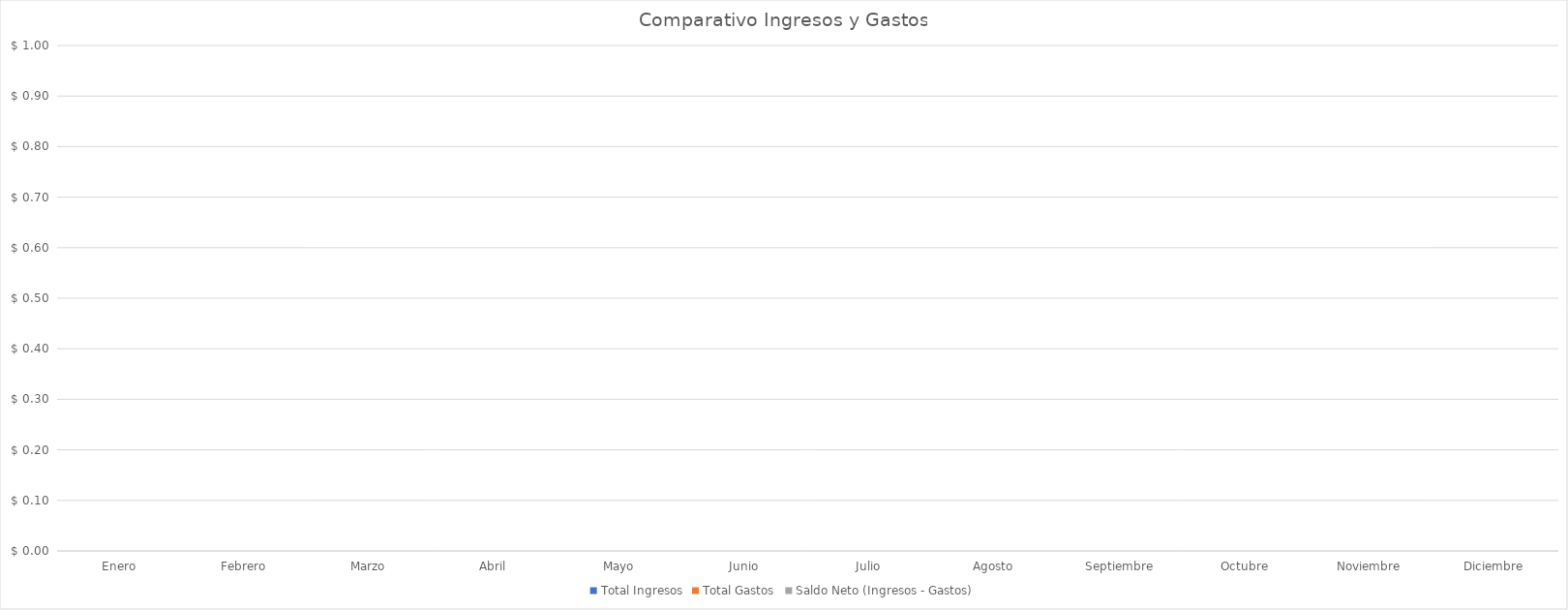
| Category | Total Ingresos | Total Gastos | Saldo Neto (Ingresos - Gastos) |
|---|---|---|---|
| Enero | 0 | 0 | 0 |
| Febrero | 0 | 0 | 0 |
| Marzo | 0 | 0 | 0 |
| Abril | 0 | 0 | 0 |
| Mayo | 0 | 0 | 0 |
| Junio | 0 | 0 | 0 |
| Julio | 0 | 0 | 0 |
| Agosto | 0 | 0 | 0 |
| Septiembre | 0 | 0 | 0 |
| Octubre | 0 | 0 | 0 |
| Noviembre | 0 | 0 | 0 |
| Diciembre | 0 | 0 | 0 |